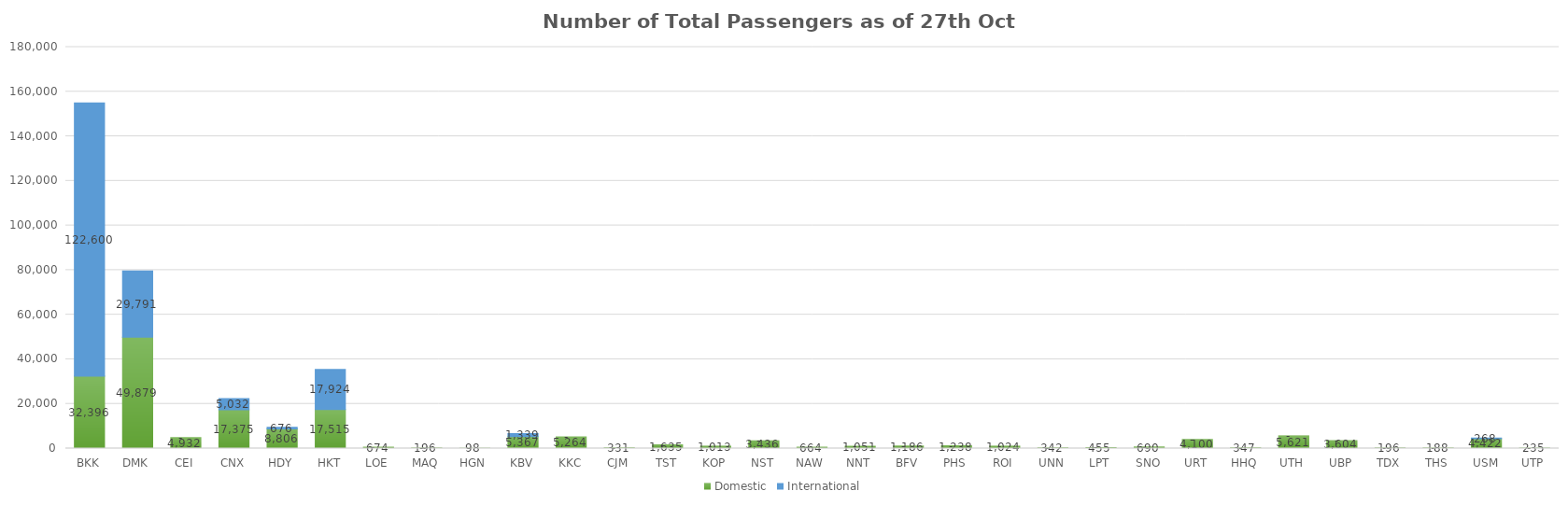
| Category | Domestic | International |
|---|---|---|
| BKK | 32396 | 122600 |
| DMK | 49879 | 29791 |
| CEI | 4932 | 0 |
| CNX | 17375 | 5032 |
| HDY | 8806 | 676 |
| HKT | 17515 | 17924 |
| LOE | 674 | 0 |
| MAQ | 196 | 0 |
| HGN | 98 | 0 |
| KBV | 5367 | 1339 |
| KKC | 5264 | 0 |
| CJM | 331 | 0 |
| TST | 1635 | 0 |
| KOP | 1013 | 0 |
| NST | 3436 | 0 |
| NAW | 664 | 0 |
| NNT | 1051 | 0 |
| BFV | 1186 | 0 |
| PHS | 1238 | 0 |
| ROI | 1024 | 0 |
| UNN | 342 | 0 |
| LPT | 455 | 0 |
| SNO | 690 | 0 |
| URT | 4100 | 0 |
| HHQ | 347 | 0 |
| UTH | 5621 | 0 |
| UBP | 3604 | 0 |
| TDX | 196 | 0 |
| THS | 188 | 0 |
| USM | 4422 | 268 |
| UTP | 235 | 0 |